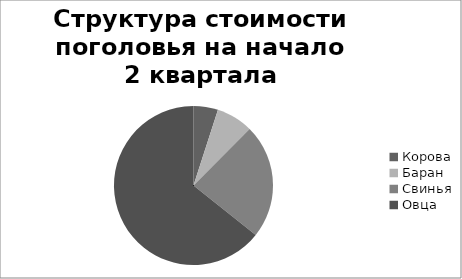
| Category | Series 0 |
|---|---|
| Корова | 300 |
| Баран | 450 |
| Свинья | 1400 |
| Овца | 3872 |